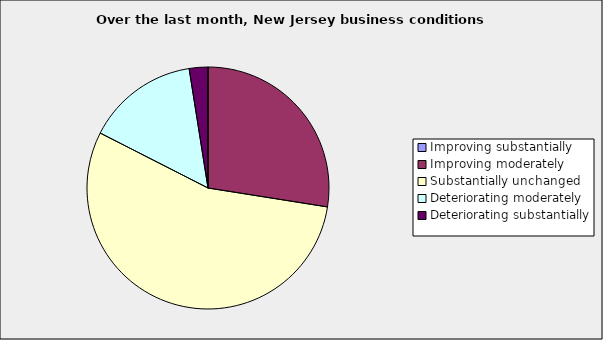
| Category | Series 0 |
|---|---|
| Improving substantially | 0 |
| Improving moderately | 0.275 |
| Substantially unchanged | 0.55 |
| Deteriorating moderately | 0.15 |
| Deteriorating substantially | 0.025 |